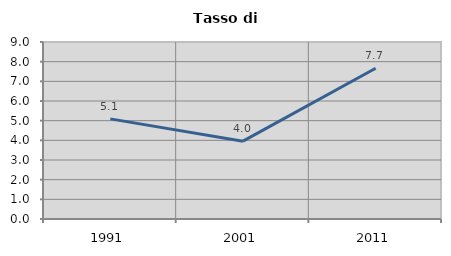
| Category | Tasso di disoccupazione   |
|---|---|
| 1991.0 | 5.091 |
| 2001.0 | 3.957 |
| 2011.0 | 7.665 |